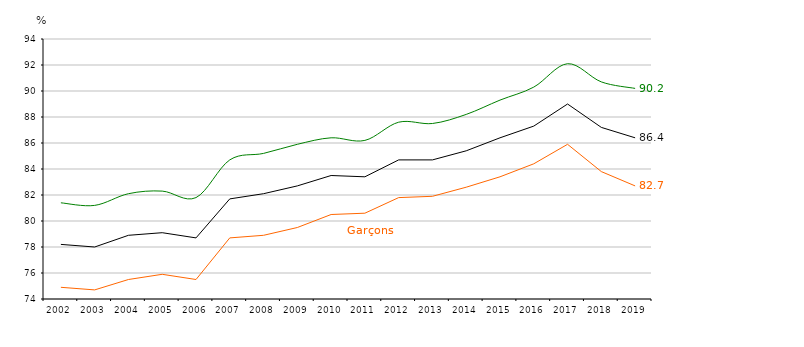
| Category | Garçons | Filles | Ensemble |
|---|---|---|---|
| 2002.0 | 74.9 | 81.4 | 78.2 |
| 2003.0 | 74.7 | 81.2 | 78 |
| 2004.0 | 75.5 | 82.1 | 78.9 |
| 2005.0 | 75.9 | 82.3 | 79.1 |
| 2006.0 | 75.5 | 81.8 | 78.7 |
| 2007.0 | 78.7 | 84.7 | 81.7 |
| 2008.0 | 78.9 | 85.2 | 82.1 |
| 2009.0 | 79.5 | 85.9 | 82.7 |
| 2010.0 | 80.5 | 86.4 | 83.5 |
| 2011.0 | 80.6 | 86.2 | 83.4 |
| 2012.0 | 81.8 | 87.6 | 84.7 |
| 2013.0 | 81.9 | 87.5 | 84.7 |
| 2014.0 | 82.6 | 88.2 | 85.4 |
| 2015.0 | 83.4 | 89.3 | 86.4 |
| 2016.0 | 84.4 | 90.3 | 87.3 |
| 2017.0 | 85.9 | 92.1 | 89 |
| 2018.0 | 83.8 | 90.7 | 87.2 |
| 2019.0 | 82.7 | 90.2 | 86.4 |